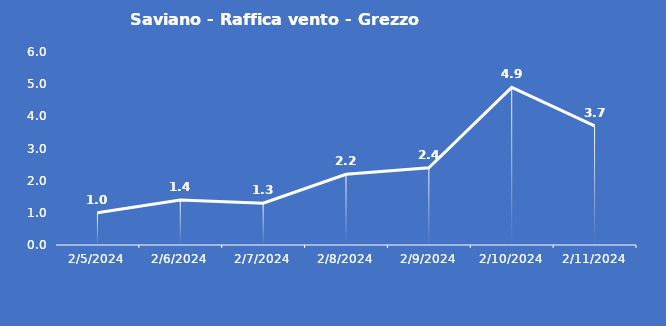
| Category | Saviano - Raffica vento - Grezzo (m/s) |
|---|---|
| 2/5/24 | 1 |
| 2/6/24 | 1.4 |
| 2/7/24 | 1.3 |
| 2/8/24 | 2.2 |
| 2/9/24 | 2.4 |
| 2/10/24 | 4.9 |
| 2/11/24 | 3.7 |